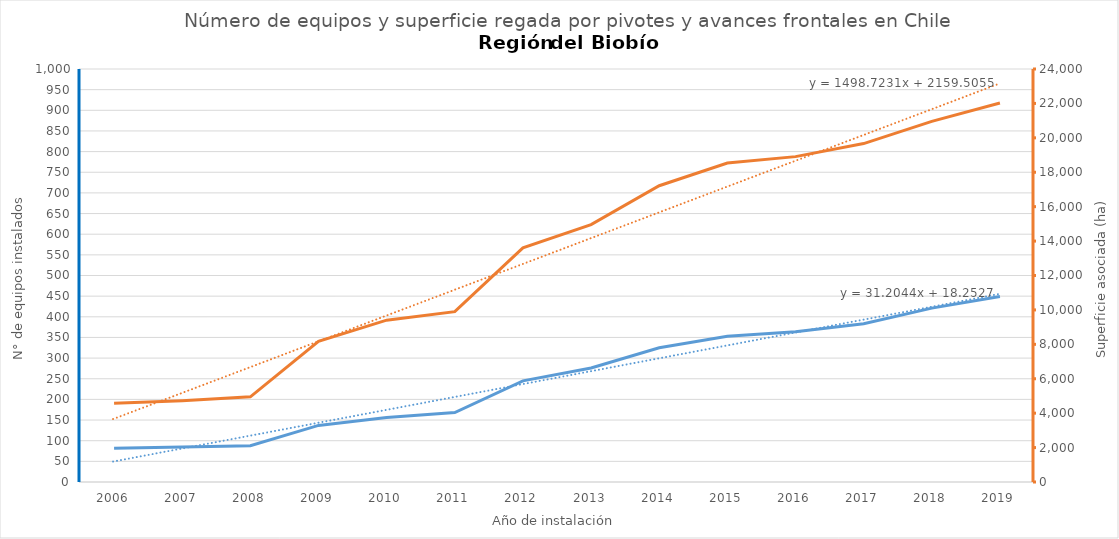
| Category | N° |
|---|---|
| 2006.0 | 82 |
| 2007.0 | 85 |
| 2008.0 | 88 |
| 2009.0 | 137 |
| 2010.0 | 156 |
| 2011.0 | 168 |
| 2012.0 | 245 |
| 2013.0 | 276 |
| 2014.0 | 325 |
| 2015.0 | 353 |
| 2016.0 | 364 |
| 2017.0 | 383 |
| 2018.0 | 421 |
| 2019.0 | 449 |